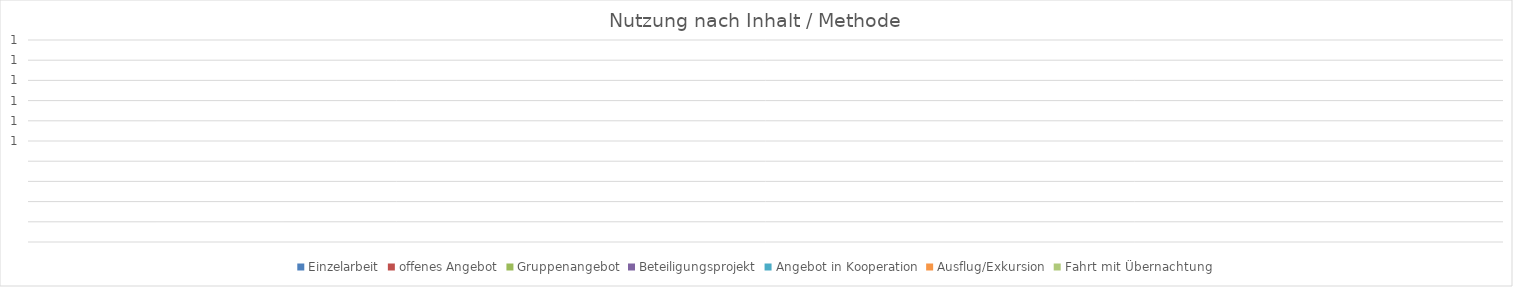
| Category | Einzelarbeit | offenes Angebot | Gruppenangebot | Beteiligungsprojekt | Angebot in Kooperation | Ausflug/Exkursion | Fahrt mit Übernachtung |
|---|---|---|---|---|---|---|---|
| 0 | 0 | 0 | 0 | 0 | 0 | 0 | 0 |